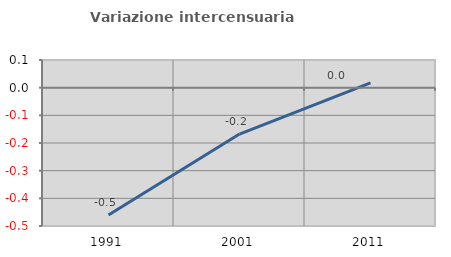
| Category | Variazione intercensuaria annua |
|---|---|
| 1991.0 | -0.461 |
| 2001.0 | -0.168 |
| 2011.0 | 0.017 |